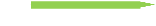
| Category | A first step in the automation journey |
|---|---|
| A first step in the automation journey | 4 |